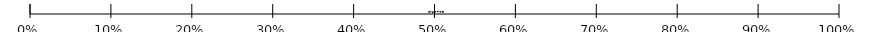
| Category | erreichte Punkte | DiffzuMax |
|---|---|---|
| 0 | 0 |  |